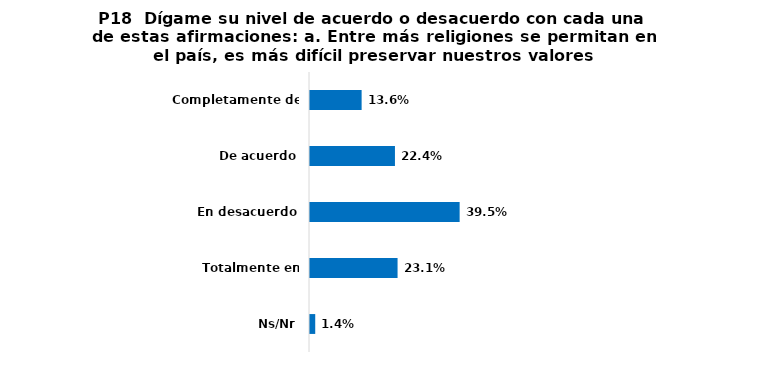
| Category | Series 0 |
|---|---|
| Completamente de acuerdo | 0.136 |
| De acuerdo | 0.224 |
| En desacuerdo | 0.395 |
| Totalmente en desacuerdo | 0.231 |
| Ns/Nr | 0.014 |